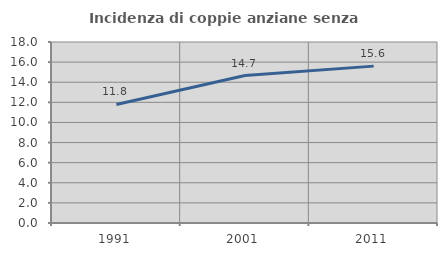
| Category | Incidenza di coppie anziane senza figli  |
|---|---|
| 1991.0 | 11.789 |
| 2001.0 | 14.667 |
| 2011.0 | 15.601 |